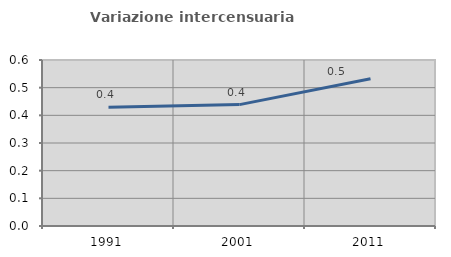
| Category | Variazione intercensuaria annua |
|---|---|
| 1991.0 | 0.429 |
| 2001.0 | 0.439 |
| 2011.0 | 0.532 |